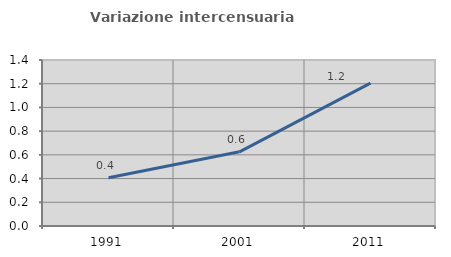
| Category | Variazione intercensuaria annua |
|---|---|
| 1991.0 | 0.407 |
| 2001.0 | 0.626 |
| 2011.0 | 1.205 |